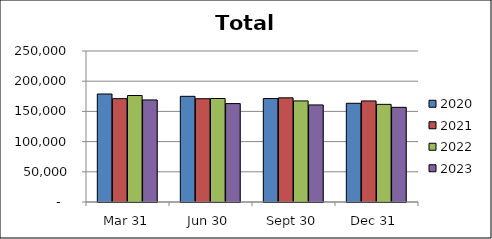
| Category | 2020 | 2021 | 2022 | 2023 |
|---|---|---|---|---|
| Mar 31 | 178821 | 171102 | 176312 | 168993 |
| Jun 30 | 174972 | 171007 | 171337 | 162929 |
| Sept 30 | 171286 | 172453 | 167369 | 160723 |
| Dec 31 | 163422 | 167321 | 161679 | 156735 |